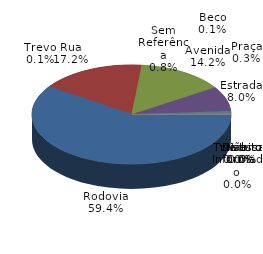
| Category | Qtde Acidentes |
|---|---|
| Rodovia | 910 |
| Rua | 263 |
| Avenida | 217 |
| Estrada | 122 |
| Sem Referência | 13 |
| Praça | 4 |
| Beco | 1 |
| Trevo | 1 |
| Distrito | 0 |
| Não Informado | 0 |
| Travessa | 0 |
| Viaduto | 0 |